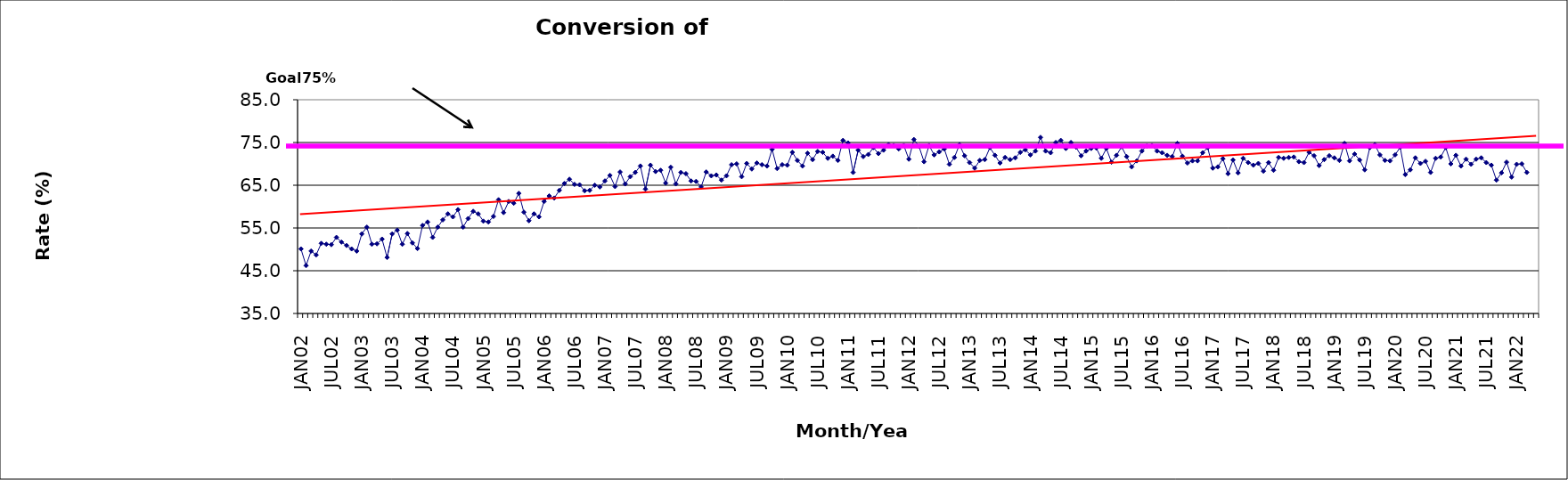
| Category | Series 0 |
|---|---|
| JAN02 | 50.1 |
| FEB02 | 46.2 |
| MAR02 | 49.6 |
| APR02 | 48.7 |
| MAY02 | 51.4 |
| JUN02 | 51.2 |
| JUL02 | 51.1 |
| AUG02 | 52.8 |
| SEP02 | 51.7 |
| OCT02 | 50.9 |
| NOV02 | 50.1 |
| DEC02 | 49.6 |
| JAN03 | 53.6 |
| FEB03 | 55.2 |
| MAR03 | 51.2 |
| APR03 | 51.3 |
| MAY03 | 52.4 |
| JUN03 | 48.1 |
| JUL03 | 53.6 |
| AUG03 | 54.5 |
| SEP03 | 51.2 |
| OCT03 | 53.7 |
| NOV03 | 51.5 |
| DEC03 | 50.2 |
| JAN04 | 55.6 |
| FEB04 | 56.4 |
| MAR04 | 52.8 |
| APR04 | 55.2 |
| MAY04 | 56.9 |
| JUN04 | 58.3 |
| JUL04 | 57.6 |
| AUG04 | 59.3 |
| SEP04 | 55.2 |
| OCT04 | 57.2 |
| NOV04 | 58.9 |
| DEC04 | 58.3 |
| JAN05 | 56.6 |
| FEB05 | 56.4 |
| MAR05 | 57.7 |
| APR05 | 61.6 |
| MAY05 | 58.6 |
| JUN05 | 61.2 |
| JUL05 | 60.8 |
| AUG05 | 63.1 |
| SEP05 | 58.7 |
| OCT05 | 56.7 |
| NOV05 | 58.3 |
| DEC05 | 57.6 |
| JAN06 | 61.2 |
| FEB06 | 62.5 |
| MAR06 | 62 |
| APR06 | 63.8 |
| MAY06 | 65.4 |
| JUN06 | 66.4 |
| JUL06 | 65.2 |
| AUG06 | 65.1 |
| SEP06 | 63.7 |
| OCT06 | 63.8 |
| NOV06 | 65 |
| DEC06 | 64.6 |
| JAN07 | 66 |
| FEB07 | 67.3 |
| MAR07 | 64.7 |
| APR07 | 68.1 |
| MAY07 | 65.3 |
| JUN07 | 67 |
| JUL07 | 68 |
| AUG07 | 69.5 |
| SEP07 | 64.1 |
| OCT07 | 69.7 |
| NOV07 | 68.2 |
| DEC07 | 68.5 |
| JAN08 | 65.5 |
| FEB08 | 69.2 |
| MAR08 | 65.3 |
| APR08 | 68 |
| MAY08 | 67.7 |
| JUN08 | 66 |
| JUL08 | 65.9 |
| AUG08 | 64.6 |
| SEP08 | 68.1 |
| OCT08 | 67.2 |
| NOV08 | 67.4 |
| DEC08 | 66.2 |
| JAN09 | 67.2 |
| FEB09 | 69.8 |
| MAR09 | 70 |
| APR09 | 67 |
| MAY09 | 70.1 |
| JUN09 | 68.8 |
| JUL09 | 70.2 |
| AUG09 | 69.8 |
| SEP09 | 69.5 |
| OCT09 | 73.4 |
| NOV09 | 68.9 |
| DEC09 | 69.8 |
| JAN10 | 69.7 |
| FEB10 | 72.7 |
| MAR10 | 70.8 |
| APR10 | 69.5 |
| MAY10 | 72.5 |
| JUN10 | 71 |
| JUL10 | 72.9 |
| AUG10 | 72.7 |
| SEP10 | 71.3 |
| OCT10 | 71.8 |
| NOV10 | 70.8 |
| DEC10 | 75.5 |
| JAN11 | 74.9 |
| FEB11 | 68 |
| MAR11 | 73.2 |
| APR11 | 71.7 |
| MAY11 | 72.2 |
| JUN11 | 73.8 |
| JUL11 | 72.4 |
| AUG11 | 73.2 |
| SEP11 | 74.5 |
| OCT11 | 74.3 |
| NOV11 | 73.5 |
| DEC11 | 74.3 |
| JAN12 | 71.1 |
| FEB12 | 75.7 |
| MAR12 | 74.1 |
| APR12 | 70.5 |
| MAY12 | 74.3 |
| JUN12 | 72.1 |
| JUL12 | 72.8 |
| AUG12 | 73.5 |
| SEP12 | 69.9 |
| OCT12 | 71.5 |
| NOV12 | 74.5 |
| DEC12 | 71.9 |
| JAN13 | 70.3 |
| FEB13 | 69 |
| MAR13 | 70.8 |
| APR13 | 71 |
| MAY13 | 73.8 |
| JUN13 | 72 |
| JUL13 | 70.2 |
| AUG13 | 71.5 |
| SEP13 | 71 |
| OCT13 | 71.4 |
| NOV13 | 72.7 |
| DEC13 | 73.3 |
| JAN14 | 72.1 |
| FEB14 | 73 |
| MAR14 | 76.2 |
| APR14 | 73 |
| MAY14 | 72.6 |
| JUN14 | 75 |
| JUL14 | 75.5 |
| AUG14 | 73.6 |
| SEP14 | 75 |
| OCT14 | 73.9 |
| NOV14 | 71.9 |
| DEC14 | 73 |
| JAN15 | 73.6 |
| FEB15 | 73.7 |
| MAR15 | 71.3 |
| APR15 | 73.6 |
| MAY15 | 70.4 |
| JUN15 | 72 |
| JUL15 | 74 |
| AUG15 | 71.7 |
| SEP15 | 69.3 |
| OCT15 | 70.7 |
| NOV15 | 73 |
| DEC15 | 74.2 |
| JAN16 | 74.3 |
| FEB16 | 73 |
| MAR16 | 72.6 |
| APR16 | 72 |
| MAY16 | 71.7 |
| JUN16 | 74.8 |
| JUL16 | 71.8 |
| AUG16 | 70.2 |
| SEP16 | 70.7 |
| OCT16 | 70.7 |
| NOV16 | 72.6 |
| DEC16 | 73.8 |
| JAN17 | 69 |
| FEB17 | 69.3 |
| MAR17 | 71.2 |
| APR17 | 67.7 |
| MAY17 | 70.9 |
| JUN17 | 67.9 |
| JUL17 | 71.3 |
| AUG17 | 70.3 |
| SEP17 | 69.7 |
| OCT17 | 70.1 |
| NOV17 | 68.3 |
| DEC17 | 70.3 |
| JAN18 | 68.5 |
| FEB18 | 71.5 |
| MAR18 | 71.3 |
| APR18 | 71.5 |
| MAY18 | 71.6 |
| JUN18 | 70.5 |
| JUL18 | 70.3 |
| AUG18 | 72.7 |
| SEP18 | 71.9 |
| OCT18 | 69.6 |
| NOV18 | 71 |
| DEC18 | 71.9 |
| JAN19 | 71.4 |
| FEB19 | 70.8 |
| MAR19 | 74.8 |
| APR19 | 70.7 |
| MAY19 | 72.3 |
| JUN19 | 70.9 |
| JUL19 | 68.6 |
| AUG19 | 73.8 |
| SEP19 | 74.5 |
| OCT19 | 72.1 |
| NOV19 | 70.8 |
| DEC19 | 70.7 |
| JAN20 | 72.1 |
| FEB20 | 73.9 |
| MAR20 | 67.5 |
| APR20 | 68.6 |
| MAY20 | 71.4 |
| JUN20 | 70.1 |
| JUL20 | 70.6 |
| AUG20 | 68 |
| SEP20 | 71.3 |
| OCT20 | 71.6 |
| NOV20 | 73.8 |
| DEC20 | 70 |
| JAN21 | 72 |
| FEB21 | 69.5 |
| MAR21 | 71.1 |
| APR21 | 69.9 |
| MAY21 | 71.1 |
| JUN21 | 71.4 |
| JUL21 | 70.3 |
| AUG21 | 69.7 |
| SEP21 | 66.2 |
| OCT21 | 67.9 |
| NOV21 | 70.4 |
| DEC21 | 66.9 |
| JAN22 | 69.9 |
| FEB22 | 70 |
| MAR22 | 68 |